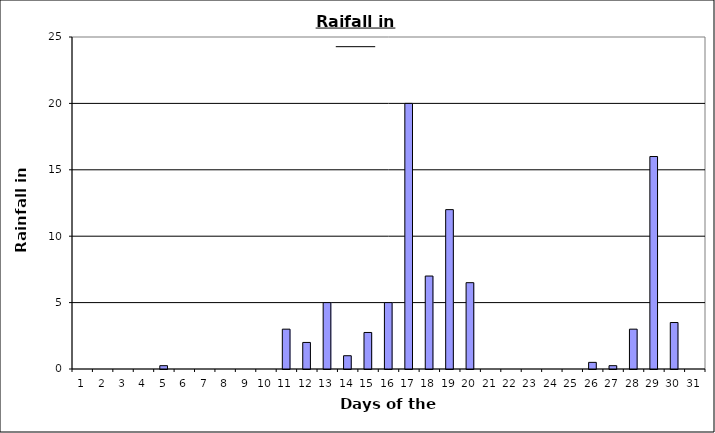
| Category | Series 0 |
|---|---|
| 0 | 0 |
| 1 | 0 |
| 2 | 0 |
| 3 | 0 |
| 4 | 0.25 |
| 5 | 0 |
| 6 | 0 |
| 7 | 0 |
| 8 | 0 |
| 9 | 0 |
| 10 | 3 |
| 11 | 2 |
| 12 | 5 |
| 13 | 1 |
| 14 | 2.75 |
| 15 | 5 |
| 16 | 20 |
| 17 | 7 |
| 18 | 12 |
| 19 | 6.5 |
| 20 | 0 |
| 21 | 0 |
| 22 | 0 |
| 23 | 0 |
| 24 | 0 |
| 25 | 0.5 |
| 26 | 0.25 |
| 27 | 3 |
| 28 | 16 |
| 29 | 3.5 |
| 30 | 0 |